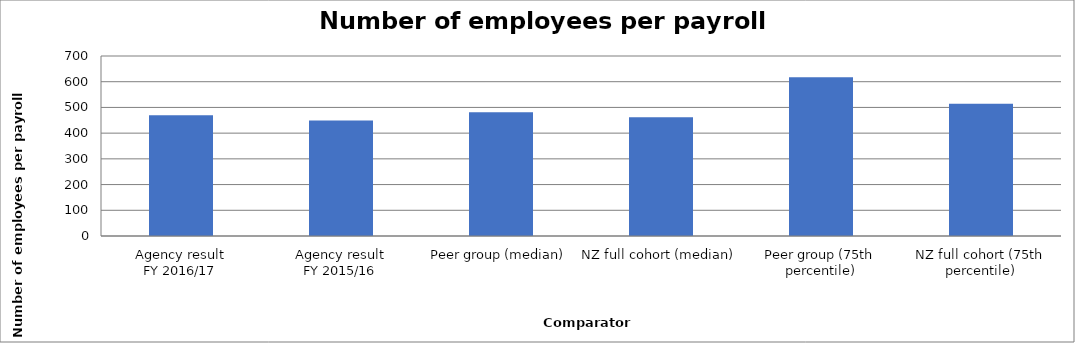
| Category | Result |
|---|---|
| Agency result
FY 2016/17 | 469.526 |
| Agency result
FY 2015/16 | 449.554 |
| Peer group (median) | 481.013 |
| NZ full cohort (median) | 461.686 |
| Peer group (75th percentile) | 617.333 |
| NZ full cohort (75th percentile) | 514.437 |